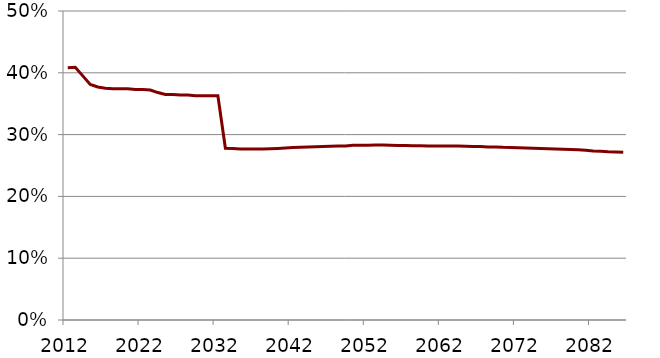
| Category | Series 1 |
|---|---|
| 2012.0 | 0.408 |
| 2013.0 | 0.409 |
| 2014.0 | 0.395 |
| 2015.0 | 0.381 |
| 2016.0 | 0.377 |
| 2017.0 | 0.375 |
| 2018.0 | 0.374 |
| 2019.0 | 0.374 |
| 2020.0 | 0.374 |
| 2021.0 | 0.373 |
| 2022.0 | 0.373 |
| 2023.0 | 0.372 |
| 2024.0 | 0.368 |
| 2025.0 | 0.365 |
| 2026.0 | 0.365 |
| 2027.0 | 0.364 |
| 2028.0 | 0.364 |
| 2029.0 | 0.363 |
| 2030.0 | 0.363 |
| 2031.0 | 0.363 |
| 2032.0 | 0.363 |
| 2033.0 | 0.278 |
| 2034.0 | 0.277 |
| 2035.0 | 0.277 |
| 2036.0 | 0.277 |
| 2037.0 | 0.277 |
| 2038.0 | 0.277 |
| 2039.0 | 0.277 |
| 2040.0 | 0.278 |
| 2041.0 | 0.278 |
| 2042.0 | 0.279 |
| 2043.0 | 0.28 |
| 2044.0 | 0.28 |
| 2045.0 | 0.28 |
| 2046.0 | 0.281 |
| 2047.0 | 0.281 |
| 2048.0 | 0.282 |
| 2049.0 | 0.282 |
| 2050.0 | 0.283 |
| 2051.0 | 0.283 |
| 2052.0 | 0.283 |
| 2053.0 | 0.283 |
| 2054.0 | 0.283 |
| 2055.0 | 0.283 |
| 2056.0 | 0.283 |
| 2057.0 | 0.282 |
| 2058.0 | 0.282 |
| 2059.0 | 0.282 |
| 2060.0 | 0.282 |
| 2061.0 | 0.282 |
| 2062.0 | 0.282 |
| 2063.0 | 0.282 |
| 2064.0 | 0.281 |
| 2065.0 | 0.281 |
| 2066.0 | 0.281 |
| 2067.0 | 0.281 |
| 2068.0 | 0.28 |
| 2069.0 | 0.28 |
| 2070.0 | 0.279 |
| 2071.0 | 0.279 |
| 2072.0 | 0.279 |
| 2073.0 | 0.278 |
| 2074.0 | 0.278 |
| 2075.0 | 0.277 |
| 2076.0 | 0.277 |
| 2077.0 | 0.277 |
| 2078.0 | 0.276 |
| 2079.0 | 0.276 |
| 2080.0 | 0.275 |
| 2081.0 | 0.275 |
| 2082.0 | 0.273 |
| 2083.0 | 0.273 |
| 2084.0 | 0.272 |
| 2085.0 | 0.272 |
| 2086.0 | 0.271 |